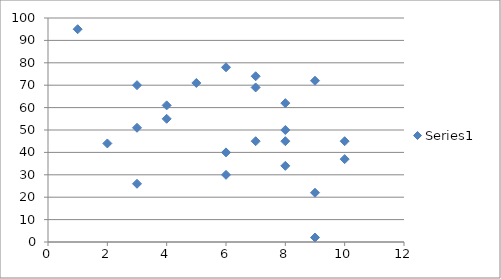
| Category | Series 0 |
|---|---|
| 3.0 | 51 |
| 2.0 | 44 |
| 6.0 | 40 |
| 8.0 | 34 |
| 5.0 | 71 |
| 9.0 | 22 |
| 6.0 | 30 |
| 8.0 | 45 |
| 3.0 | 26 |
| 4.0 | 61 |
| 9.0 | 72 |
| 3.0 | 70 |
| 7.0 | 74 |
| 10.0 | 45 |
| 9.0 | 2 |
| 6.0 | 78 |
| 8.0 | 50 |
| 1.0 | 95 |
| 10.0 | 37 |
| 8.0 | 62 |
| 7.0 | 69 |
| 4.0 | 55 |
| 7.0 | 45 |